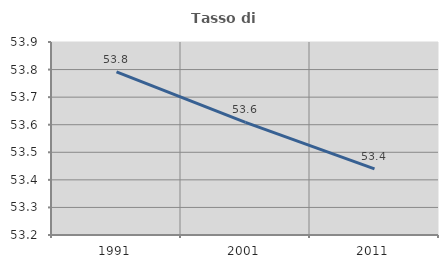
| Category | Tasso di occupazione   |
|---|---|
| 1991.0 | 53.792 |
| 2001.0 | 53.608 |
| 2011.0 | 53.44 |